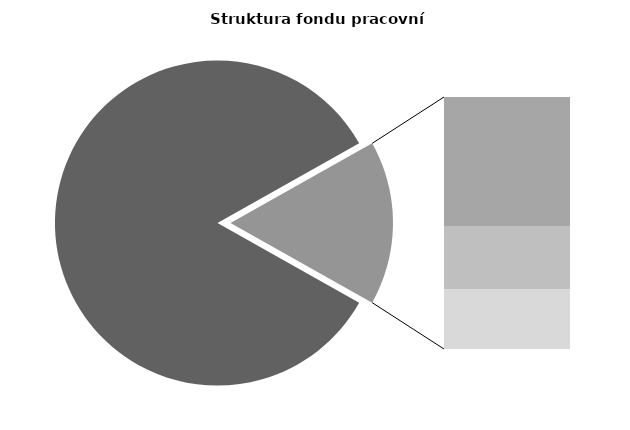
| Category | Series 0 |
|---|---|
| Průměrná měsíční odpracovaná doba bez přesčasu | 141.813 |
| Dovolená | 14.137 |
| Nemoc | 6.958 |
| Jiné | 6.527 |